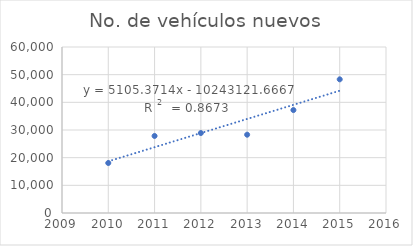
| Category | No. de vehículos nuevos |
|---|---|
| 2010.0 | 18071 |
| 2012.0 | 27845 |
| 2013.0 | 28898 |
| 2014.0 | 28300 |
| 2015.0 | 37202 |
| 2016.0 | 48314 |